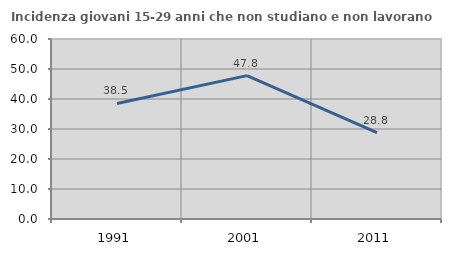
| Category | Incidenza giovani 15-29 anni che non studiano e non lavorano  |
|---|---|
| 1991.0 | 38.53 |
| 2001.0 | 47.788 |
| 2011.0 | 28.788 |